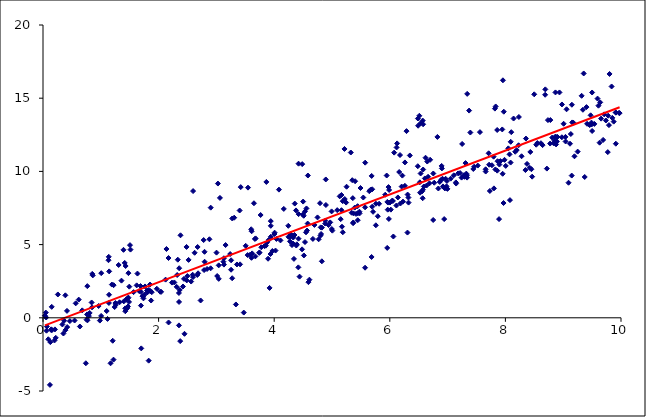
| Category | Series 0 |
|---|---|
| 9.09214193 | 9.226 |
| 7.73094449 | 8.663 |
| 7.96784314 | 7.84 |
| 6.21715943 | 9.713 |
| 7.80181084 | 8.841 |
| 9.53953478 | 13.244 |
| 5.57186894 | 3.42 |
| 2.1716921 | 4.085 |
| 4.55813861 | 7.47 |
| 4.30812811 | 4.968 |
| 0.983887791 | -0.19 |
| 9.19486152 | 11.032 |
| 5.69596444 | 8.778 |
| 2.35391531 | 1.083 |
| 0.741468446 | -3.105 |
| 1.20622191 | -1.568 |
| 2.13610764 | 4.7 |
| 6.2052832 | 8.963 |
| 5.95518034 | 4.773 |
| 8.97702256 | 12.332 |
| 9.6300482 | 11.963 |
| 8.10172595 | 12.679 |
| 4.51350669 | 4.259 |
| 9.69084598 | 12.151 |
| 3.27332773 | 2.702 |
| 8.43104463 | 11.329 |
| 6.06165876 | 5.554 |
| 4.49460797 | 7.053 |
| 4.60908685 | 2.604 |
| 3.60214925 | 6.047 |
| 5.68477606 | 4.155 |
| 4.66966127 | 5.389 |
| 2.44821177 | -1.093 |
| 6.75089173 | 6.681 |
| 1.7000925 | -2.089 |
| 1.66489539 | 1.823 |
| 3.92028448 | 2.041 |
| 5.18673108 | 5.844 |
| 2.77939124 | 5.311 |
| 8.07864525 | 8.038 |
| 2.3735837 | -1.593 |
| 7.55933738 | 12.684 |
| 5.13345519 | 8.297 |
| 2.51870786 | 3.954 |
| 9.37237474 | 9.618 |
| 6.94092202 | 6.744 |
| 3.47347018 | 0.357 |
| 1.16874791 | -3.107 |
| 1.22022199 | -2.859 |
| 3.33730571 | 0.912 |
| 9.91048198 | 11.892 |
| 8.42129982 | 10.246 |
| 0.206671698 | -0.791 |
| 6.4843481 | 10.354 |
| 9.14722657 | 9.715 |
| 0.84874672 | 0.716 |
| 4.4389659 | 2.812 |
| 5.9462981 | 9.719 |
| 0.119493964 | -4.582 |
| 4.51046758 | 6.969 |
| 5.68622801 | 9.69 |
| 6.53330364 | 9.858 |
| 5.24469467 | 7.871 |
| 2.33171315 | 3.968 |
| 2.17258428 | -0.318 |
| 1.1164724 | -0.078 |
| 8.53363023 | 11.822 |
| 4.59207945 | 2.434 |
| 9.3413851 | 14.21 |
| 1.423125 | 0.646 |
| 5.25211799 | 8.953 |
| 8.44975986 | 10.149 |
| 6.30581833 | 5.821 |
| 3.13065817 | 3.633 |
| 4.48220544 | 4.676 |
| 4.3412922 | 4.024 |
| 2.62332655 | 4.442 |
| 5.7589141 | 6.319 |
| 1.39826337 | 1.121 |
| 8.34654802 | 10.092 |
| 5.5414156 | 8.215 |
| 5.18564613 | 7.966 |
| 2.31240365 | 2.114 |
| 8.61456682 | 11.927 |
| 1.82822638 | -2.928 |
| 1.25997063 | 0.881 |
| 5.98353379 | 6.754 |
| 8.87683015 | 11.844 |
| 2.35202778 | -0.518 |
| 6.60656315 | 9.52 |
| 4.4224596 | 7.081 |
| 8.05066739 | 11.574 |
| 9.77137147 | 11.317 |
| 6.26208838 | 10.613 |
| 7.44459369 | 10.165 |
| 4.82454293 | 3.859 |
| 5.57222481 | 7.546 |
| 4.41793735 | 3.445 |
| 8.498654960692358 | 15.266 |
| 5.163454744566504 | 8.387 |
| 5.445845676247458 | 6.668 |
| 3.4094557169609363 | 3.652 |
| 5.089872537316094 | 7.353 |
| 2.796236799336622 | 3.829 |
| 3.3553365657520917 | 3.643 |
| 5.573966050809718 | 10.597 |
| 1.1405256196458247 | 1.012 |
| 6.002723661364393 | 7.873 |
| 4.247385374711667 | 5.531 |
| 2.5899652593558353 | 2.941 |
| 3.856389470348711 | 4.926 |
| 4.3293947390416765 | 5.482 |
| 9.488624038798692 | 13.332 |
| 1.252853786427286 | 1.01 |
| 5.792104739013508 | 6.937 |
| 5.325049374947747 | 11.29 |
| 1.6340339228916534 | 3.021 |
| 7.94593131922432 | 12.866 |
| 4.166126749997048 | 7.438 |
| 0.35354353741588795 | -1.073 |
| 4.272841113160187 | 5.221 |
| 7.182313270619229 | 9.865 |
| 8.355378690008521 | 12.244 |
| 9.594377652420633 | 14.974 |
| 2.4221504716819453 | 2.139 |
| 8.834973267652773 | 11.918 |
| 6.346243302467851 | 11.089 |
| 9.117770125778462 | 11.889 |
| 3.402149060258597 | 7.329 |
| 5.006036796009923 | 5.953 |
| 6.886491298998352 | 9.411 |
| 2.365753917343598 | 1.901 |
| 2.68301960259252 | 3.039 |
| 9.150091433767296 | 14.553 |
| 1.144664187281501 | 3.17 |
| 1.8514183165426168 | 2.269 |
| 8.866205409435848 | 15.395 |
| 7.241567808026197 | 9.576 |
| 3.5467090203525475 | 8.891 |
| 0.7627152341766408 | 0.234 |
| 4.800506311563257 | 5.611 |
| 9.91122221451099 | 14.011 |
| 3.1298162215125824 | 4.068 |
| 6.618233797602377 | 10.934 |
| 0.8525446832435013 | 3 |
| 8.09190796640454 | 12.022 |
| 5.446111591751139 | 7.14 |
| 1.1377542072032565 | 4.165 |
| 8.090021662643325 | 10.603 |
| 6.823624893396789 | 12.354 |
| 5.339735175272047 | 7.178 |
| 6.920232629388831 | 8.975 |
| 3.2384547362536154 | 4.354 |
| 9.8373755329407 | 15.801 |
| 4.8256411591609805 | 6.16 |
| 7.522274138583249 | 10.398 |
| 7.281089292552458 | 9.735 |
| 6.576493162966495 | 13.219 |
| 7.143261879921159 | 9.25 |
| 2.379058155796603 | 5.636 |
| 4.382051538519313 | 4.937 |
| 1.7286565252373598 | 1.465 |
| 5.49323553058448 | 8.866 |
| 9.965606270602416 | 13.998 |
| 3.040116361729548 | 3.583 |
| 8.690891498105863 | 15.604 |
| 5.6949934178282025 | 7.587 |
| 5.710377020342401 | 7.24 |
| 7.8580010287960045 | 12.828 |
| 3.744694891336273 | 4.464 |
| 8.778074624569214 | 13.506 |
| 7.310312849675357 | 10.569 |
| 4.285620539617804 | 5.71 |
| 6.322354733436741 | 8.213 |
| 2.2315282967237082 | 2.404 |
| 3.50680669059515 | 4.917 |
| 5.367929196264796 | 6.511 |
| 7.251810583574567 | 11.876 |
| 0.032648962740822185 | 0.141 |
| 3.12141324390635 | 3.832 |
| 6.289004382690813 | 12.751 |
| 1.3086412443964068 | 3.608 |
| 2.3217560734071774 | 2.925 |
| 0.14145823444282613 | -0.837 |
| 8.169997320603745 | 11.342 |
| 8.005788583368625 | 10.376 |
| 6.519533521942888 | 9.255 |
| 0.09134565557880059 | -1.467 |
| 1.101807709501168 | 0.463 |
| 3.60999913618806 | 5.91 |
| 8.862057695934995 | 12.369 |
| 6.637214147233665 | 9.038 |
| 7.323838367739111 | 9.849 |
| 3.6183896033488883 | 4.399 |
| 7.8962395661564555 | 10.468 |
| 0.7680377098806024 | -0.175 |
| 3.0020486930644386 | 4.451 |
| 6.017878140233099 | 7.387 |
| 1.6954447009960338 | 1.766 |
| 4.007136932686035 | 5.815 |
| 1.9686569618121053 | 1.984 |
| 6.996969959662005 | 8.805 |
| 5.9881481452474805 | 8.731 |
| 3.308265585188872 | 6.838 |
| 9.041516206091643 | 12.044 |
| 6.572777827128213 | 8.748 |
| 0.3880344278604042 | -0.844 |
| 1.5051788029239521 | 4.964 |
| 5.4429712832420085 | 7.626 |
| 9.490853698167179 | 13.203 |
| 4.968910102839397 | 6.516 |
| 5.365483177132733 | 6.462 |
| 6.698350043859149 | 10.793 |
| 1.6941838803347231 | 0.833 |
| 4.484493400009644 | 10.497 |
| 7.8903828523821495 | 6.742 |
| 8.77379721576282 | 11.902 |
| 9.176660730311417 | 13.324 |
| 1.4135924929262988 | 3.748 |
| 4.377394823056315 | 7.335 |
| 4.243818768274341 | 6.284 |
| 2.9012296601372434 | 7.523 |
| 1.4677999427926225 | 1.328 |
| 8.850093267965422 | 12.106 |
| 4.79274557029203 | 7.827 |
| 9.250060212297361 | 11.351 |
| 3.6739445272245197 | 4.194 |
| 2.5634850895736427 | 2.477 |
| 9.402733102567202 | 14.393 |
| 8.73580173724072 | 13.504 |
| 6.589376395927491 | 8.971 |
| 5.216003403953611 | 11.533 |
| 7.9848542353849306 | 10.79 |
| 1.1330083820892867 | 3.933 |
| 0.6789448919147967 | 0.509 |
| 6.76901909780738 | 9.227 |
| 6.486293914793655 | 13.613 |
| 8.978948917083578 | 14.572 |
| 1.6871419809884225 | 2.17 |
| 3.4208672870853274 | 8.928 |
| 1.4419552557102744 | 1.265 |
| 2.787355814897108 | 3.26 |
| 7.372356743053304 | 14.154 |
| 1.7375385257517406 | 1.327 |
| 7.971972342946636 | 14.077 |
| 2.596367964512105 | 8.657 |
| 3.9683628429778928 | 4.562 |
| 3.941254589416827 | 6.283 |
| 9.801917640355775 | 16.656 |
| 0.055203368538556674 | 0.019 |
| 7.658241522449291 | 10.144 |
| 2.6702250271780237 | 2.926 |
| 2.7270468586034036 | 1.183 |
| 1.1419442312216033 | 1.574 |
| 4.5506393858648675 | 5.839 |
| 0.060503575811612365 | -0.882 |
| 0.0486711432149628 | 0.357 |
| 1.2394882492330073 | 0.734 |
| 6.523956286768479 | 8.547 |
| 0.7940843459245972 | 0.117 |
| 9.007457762033344 | 13.254 |
| 1.8314434350190556 | 1.905 |
| 6.577134573709362 | 10.13 |
| 0.38670715099446085 | 1.534 |
| 0.36522624383226177 | -0.199 |
| 7.2161926911738306 | 9.886 |
| 6.511081730778585 | 13.8 |
| 4.8050001233502115 | 6.179 |
| 3.666581661681152 | 5.385 |
| 4.892477198378646 | 9.449 |
| 9.500293656745802 | 15.39 |
| 2.900179275751844 | 3.381 |
| 1.881556294340525 | 1.75 |
| 3.0262558719003962 | 9.169 |
| 7.337435298616812 | 9.575 |
| 4.038188422603977 | 5.386 |
| 5.220468369479347 | 8.114 |
| 0.19869643820853655 | -1.549 |
| 3.741235828069547 | 4.435 |
| 4.696012251729433 | 6.343 |
| 1.477663452221547 | 3.051 |
| 7.393460080311087 | 12.655 |
| 6.184272520014773 | 7.808 |
| 7.818623012144597 | 14.288 |
| 6.662071448294973 | 9.632 |
| 0.15446583210299014 | -0.839 |
| 7.7959736246489175 | 11.007 |
| 3.678738949751592 | 5.423 |
| 9.155854658878164 | 13.345 |
| 3.582628109470438 | 4.308 |
| 9.318861730780855 | 15.163 |
| 3.0610660275056034 | 8.189 |
| 1.5675344209138453 | 1.753 |
| 5.350264980326102 | 9.399 |
| 5.360451803999268 | 8.172 |
| 8.233341992061245 | 13.717 |
| 4.810584176066772 | 5.724 |
| 8.717201180054435 | 10.191 |
| 6.897112034607266 | 10.374 |
| 6.9525604667211205 | 8.837 |
| 1.4880319609982529 | 1.082 |
| 1.7599831210840322 | 1.591 |
| 8.55288406126471 | 11.935 |
| 7.95256046672112 | 9.837 |
| 5.474790082807369 | 7.247 |
| 0.9621403479040769 | 0.805 |
| 5.957347780291551 | 7.914 |
| 0.8614081391967865 | 2.898 |
| 0.25699945148575987 | 1.594 |
| 7.147907389820912 | 9.17 |
| 9.873277628986488 | 13.399 |
| 5.41607617010079 | 7.098 |
| 1.620383073816658 | 2.217 |
| 3.893708046172286 | 4.034 |
| 8.935524660310525 | 15.394 |
| 8.141106430121285 | 13.61 |
| 4.941073579261861 | 6.333 |
| 3.832366124554163 | 4.901 |
| 0.5659222877529402 | 0.988 |
| 8.687714618260546 | 15.234 |
| 8.643298308397656 | 11.795 |
| 0.15103619558535009 | 0.749 |
| 6.840311798890026 | 8.833 |
| 4.355816874263483 | 7.802 |
| 5.172426329099169 | 6.222 |
| 0.7666741114258446 | 2.163 |
| 9.039115292345361 | 12.358 |
| 2.0438486082449536 | 1.772 |
| 6.0537901132036875 | 7.982 |
| 2.8377527642991263 | 3.333 |
| 1.3243081533701484 | 1.06 |
| 0.6180184208151829 | 1.242 |
| 6.9817304993047475 | 8.98 |
| 0.1426316554836049 | -0.788 |
| 3.6499905948580413 | 7.825 |
| 1.870541375343342 | 1.181 |
| 6.900886764361925 | 10.204 |
| 6.1399117043838665 | 8.221 |
| 6.261276544240646 | 9.013 |
| 1.7998922865176414 | 1.86 |
| 9.976123291926005 | 13.981 |
| 6.114036448093778 | 7.669 |
| 5.150367067779449 | 6.738 |
| 1.5135708129106806 | 4.659 |
| 7.107225211921291 | 9.733 |
| 1.191561255378697 | 2.269 |
| 6.3247959995675895 | 7.869 |
| 6.227747288821486 | 7.936 |
| 4.996689189595296 | 6.065 |
| 7.76762289708544 | 10.42 |
| 7.29359583717625 | 9.629 |
| 3.2542346853922854 | 3.928 |
| 5.644777953613076 | 8.648 |
| 1.4703597302266935 | 0.771 |
| 4.273809141498184 | 5.536 |
| 1.493317659874993 | 2.128 |
| 6.490032108341328 | 13.12 |
| 6.864464443411881 | 9.278 |
| 5.163693113362529 | 7.35 |
| 4.894750060679698 | 7.705 |
| 7.710401940816054 | 11.236 |
| 7.053309402165786 | 9.505 |
| 8.890395842884192 | 12.043 |
| 2.674927641791407 | 4.836 |
| 8.878200110343881 | 12.349 |
| 7.659032899708286 | 9.989 |
| 5.760370768110601 | 7.791 |
| 4.420517322396433 | 5.404 |
| 6.9658494743887545 | 9.498 |
| 4.421525079147708 | 10.527 |
| 6.752381468413975 | 9.857 |
| 0.4149404452256755 | 0.472 |
| 7.45918544635127 | 10.321 |
| 7.957446025172699 | 16.222 |
| 4.391145187522589 | 5.019 |
| 0.46505274619487835 | -0.226 |
| 3.040897535869007 | 2.66 |
| 8.374748085333223 | 10.511 |
| 2.483427613021556 | 4.84 |
| 7.858917858929308 | 10.051 |
| 9.131934317233073 | 12.553 |
| 3.940599548789676 | 6.605 |
| 3.7772115049966803 | 4.817 |
| 5.476693426323937 | 7.128 |
| 5.9208963748429255 | 8.406 |
| 1.0073275699233375 | 3.049 |
| 9.500443150162996 | 12.76 |
| 3.013659548942229 | 2.853 |
| 7.33430548869606 | 9.744 |
| 9.47464226683632 | 13.831 |
| 6.558558767928568 | 8.635 |
| 7.86422782451675 | 10.695 |
| 1.8554865276435994 | 1.822 |
| 3.764890110705994 | 7.022 |
| 7.826619216503234 | 10.135 |
| 8.227863763036645 | 11.785 |
| 0.06730846132008583 | -0.597 |
| 5.964057635337272 | 7.386 |
| 4.1082974447572695 | 5.285 |
| 1.3928145321172103 | 4.643 |
| 2.487477644680025 | 2.555 |
| 0.6384557253794987 | -0.595 |
| 6.12679599225471 | 11.912 |
| 6.686552734226209 | 9.185 |
| 6.308263957102995 | 8.417 |
| 6.11742432896917 | 11.636 |
| 9.457898032157402 | 13.163 |
| 4.568184900713526 | 5.961 |
| 9.85035968240136 | 13.656 |
| 1.4768568736947074 | 1.38 |
| 4.5011269504434015 | 7.939 |
| 7.832014880922973 | 14.436 |
| 9.777377063391432 | 13.805 |
| 2.7950537847837964 | 4.507 |
| 9.709467597597492 | 13.896 |
| 4.8823991410948615 | 6.436 |
| 7.338660302193611 | 15.296 |
| 9.610171677365802 | 14.489 |
| 8.195668396095847 | 11.457 |
| 6.569000716891928 | 8.168 |
| 0.5466026594795093 | -0.187 |
| 8.900442607690513 | 12.354 |
| 4.749420421826036 | 6.857 |
| 8.071995394347908 | 11.164 |
| 1.8070864517549978 | 1.742 |
| 4.532618449841454 | 7.266 |
| 6.988534875958424 | 9.346 |
| 4.325001095251368 | 5.071 |
| 0.8415084967900022 | 1.046 |
| 4.023100063815193 | 4.593 |
| 0.12732263727994741 | -1.661 |
| 0.8076230621333469 | 0.331 |
| 3.27441585738101 | 6.784 |
| 3.53998169826256 | 4.284 |
| 3.864226179427366 | 9.28 |
| 4.082080539699486 | 8.754 |
| 5.393602691616081 | 7.527 |
| 4.3215582402596375 | 5.556 |
| 3.9366875209881425 | 4.356 |
| 9.908334402883092 | 14.03 |
| 9.35487844257467 | 16.69 |
| 2.5956425287846496 | 2.78 |
| 9.640023233991048 | 14.714 |
| 4.582912704512099 | 9.719 |
| 6.911595517920666 | 9.499 |
| 1.7654113582191089 | 2.141 |
| 1.7217897250392489 | 1.476 |
| 4.993158857624014 | 7.267 |
| 4.3506429977654015 | 5.655 |
| 2.4393816677299007 | 2.659 |
| 9.655504892810324 | 13.603 |
| 6.64793771308636 | 10.674 |
| 0.33555610413936954 | -0.454 |
| 5.9778139928798435 | 8.931 |
| 6.075263980189149 | 11.282 |
| 9.057933881101201 | 14.242 |
| 7.717987013813447 | 10.458 |
| 1.3578284498681548 | 2.538 |
| 3.6068105942080053 | 4.098 |
| 5.371909194400768 | 7.133 |
| 4.8845852752784396 | 6.635 |
| 1.0059581562211317 | 0.128 |
| 8.858391482561345 | 12.014 |
| 1.4581096815090877 | 0.65 |
| 3.9416342223019907 | 5.537 |
| 2.2721212362698306 | 2.414 |
| 3.8746898569702637 | 5.137 |
| 2.121102408831459 | 2.607 |
| 9.41315923751115 | 13.251 |
| 3.2534896362086507 | 3.283 |
| 5.974281387129139 | 7.871 |
| 1.4233334082712767 | 0.448 |
| 8.810645421713662 | 12.313 |
| 6.176780383218636 | 11.118 |
| 7.913844215095356 | 10.703 |
| 4.76923728814028 | 5.363 |
| 3.1588429852097644 | 4.968 |
| 0.41872762724397994 | -0.633 |
| 8.462811050415155 | 9.641 |
| 8.279630606137921 | 11.034 |
| 4.579150759928716 | 6.437 |
| 5.814914670611184 | 7.79 |
| 9.738703079673058 | 13.477 |
| 4.004509414904502 | 5.726 |
| 2.8795624536466757 | 5.363 |
| 6.569418469958492 | 13.472 |
| 6.039849046914359 | 8.002 |
| 1.429231249359415 | 3.538 |
| 2.3562173660461116 | 3.387 |
| 0.7545066175506077 | -0.122 |
| 5.400268075270818 | 9.329 |
| 6.532434169354158 | 13.286 |
| 2.4976878149009263 | 2.851 |
| 1.2218721087191309 | 2.23 |
| 5.6670881206542045 | 8.747 |
| 4.5326842345820495 | 5.173 |
| 0.2208640331872136 | -1.369 |
| 9.791089032228633 | 13.16 |
| 6.162694315484676 | 9.958 |
| 3.9061874613272463 | 5.318 |
| 2.0269028791192145 | 1.783 |
| 2.3519795632531726 | 1.695 |